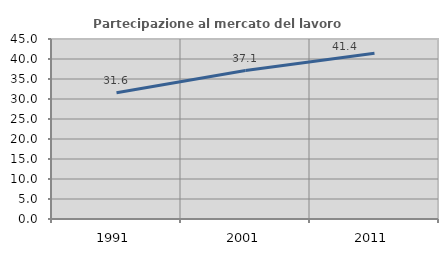
| Category | Partecipazione al mercato del lavoro  femminile |
|---|---|
| 1991.0 | 31.587 |
| 2001.0 | 37.123 |
| 2011.0 | 41.44 |